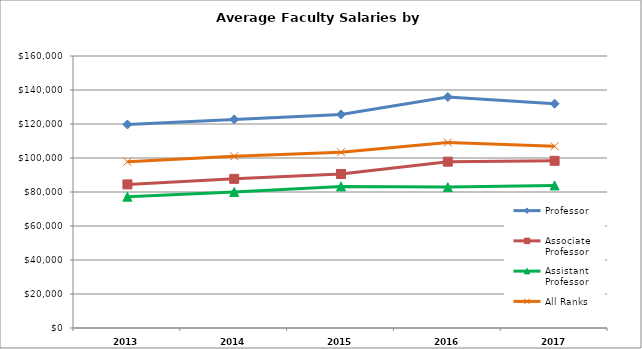
| Category | Professor | Associate Professor | Assistant Professor | All Ranks |
|---|---|---|---|---|
| 2013.0 | 119726 | 84476 | 77245 | 97762 |
| 2014.0 | 122702 | 87733 | 80033 | 101008 |
| 2015.0 | 125625.332 | 90601.495 | 83294.474 | 103427 |
| 2016.0 | 135884.43 | 97840.577 | 82888.395 | 109125 |
| 2017.0 | 131934 | 98351 | 83867 | 106900 |